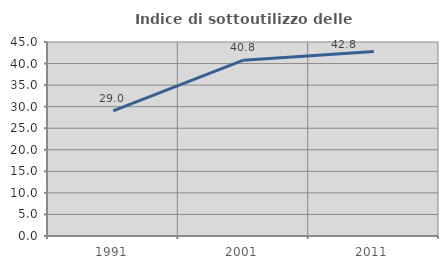
| Category | Indice di sottoutilizzo delle abitazioni  |
|---|---|
| 1991.0 | 29.032 |
| 2001.0 | 40.789 |
| 2011.0 | 42.794 |